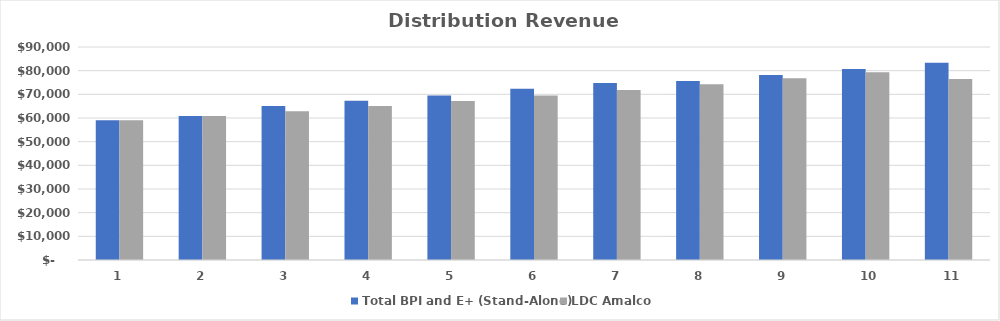
| Category | Total BPI and E+ (Stand-Alone) | LDC Amalco |
|---|---|---|
| 0 | 59049 | 59049 |
| 1 | 60855.792 | 60855.792 |
| 2 | 65098.734 | 62902.757 |
| 3 | 67257.348 | 65020.52 |
| 4 | 69489.847 | 67211.59 |
| 5 | 72408.736 | 69478.568 |
| 6 | 74813.946 | 71824.145 |
| 7 | 75609.263 | 74251.114 |
| 8 | 78123.036 | 76762.368 |
| 9 | 80722.484 | 79360.902 |
| 10 | 83370.645 | 76462.466 |